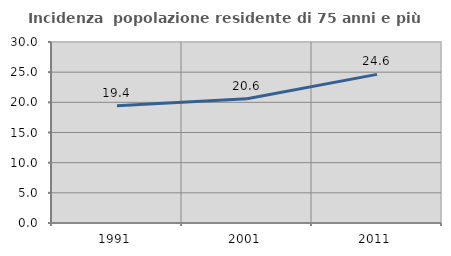
| Category | Incidenza  popolazione residente di 75 anni e più |
|---|---|
| 1991.0 | 19.436 |
| 2001.0 | 20.598 |
| 2011.0 | 24.638 |